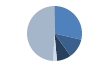
| Category | Series 0 |
|---|---|
| ARRASTRE | 421 |
| CERCO | 170 |
| PALANGRE | 123 |
| REDES DE ENMALLE | 33 |
| ARTES MENORES | 719 |
| SIN TIPO ASIGNADO | 5 |